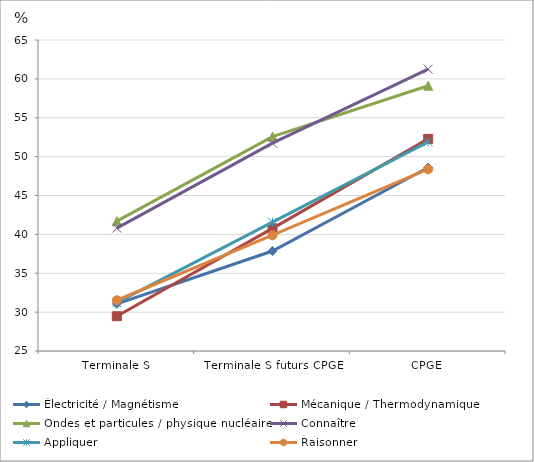
| Category | Électricité / Magnétisme | Mécanique / Thermodynamique | Ondes et particules / physique nucléaire | Connaître | Appliquer | Raisonner |
|---|---|---|---|---|---|---|
| Terminale S | 31.064 | 29.472 | 41.697 | 40.808 | 31.219 | 31.527 |
| Terminale S futurs CPGE | 37.857 | 40.776 | 52.565 | 51.74 | 41.572 | 39.893 |
| CPGE | 48.6 | 52.284 | 59.118 | 61.251 | 51.895 | 48.382 |